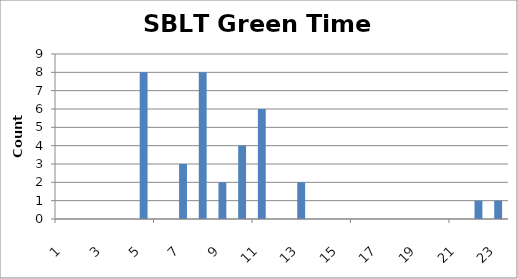
| Category | Series 0 |
|---|---|
| 0 | 0 |
| 1 | 0 |
| 2 | 0 |
| 3 | 0 |
| 4 | 8 |
| 5 | 0 |
| 6 | 3 |
| 7 | 8 |
| 8 | 2 |
| 9 | 4 |
| 10 | 6 |
| 11 | 0 |
| 12 | 2 |
| 13 | 0 |
| 14 | 0 |
| 15 | 0 |
| 16 | 0 |
| 17 | 0 |
| 18 | 0 |
| 19 | 0 |
| 20 | 0 |
| 21 | 1 |
| 22 | 1 |